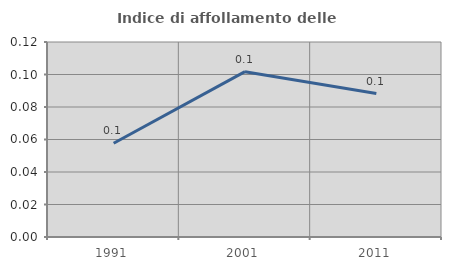
| Category | Indice di affollamento delle abitazioni  |
|---|---|
| 1991.0 | 0.058 |
| 2001.0 | 0.102 |
| 2011.0 | 0.088 |